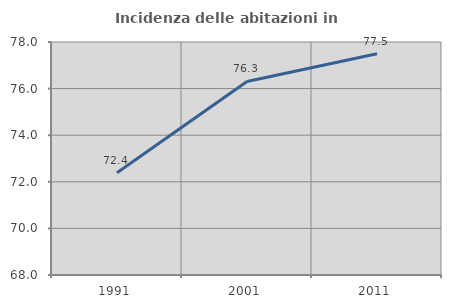
| Category | Incidenza delle abitazioni in proprietà  |
|---|---|
| 1991.0 | 72.391 |
| 2001.0 | 76.305 |
| 2011.0 | 77.5 |